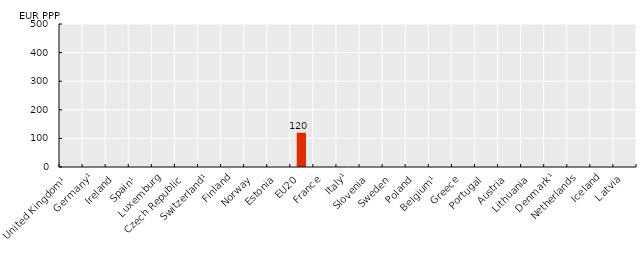
| Category | Health spending per capita PPPs  |
|---|---|
| United Kingdom¹ | 445.776 |
| Germany¹ | 301.756 |
| Ireland | 273.593 |
| Spain¹ | 220.346 |
| Luxemburg | 217.45 |
| Czech Republic | 213.857 |
| Switzerland¹ | 180.43 |
| Finland | 154.657 |
| Norway | 147.596 |
| Estonia | 120.471 |
| EU20 | 119.85 |
| France | 107.843 |
| Italy¹ | 100.73 |
| Slovenia | 98.889 |
| Sweden | 89.086 |
| Poland | 80.016 |
| Belgium¹ | 75.483 |
| Greece | 67.426 |
| Portugal | 56.809 |
| Austria | 55.49 |
| Lithuania | 53.216 |
| Denmark¹ | 50.379 |
| Netherlands | 38.743 |
| Iceland | 31.66 |
| Latvia | 20.842 |